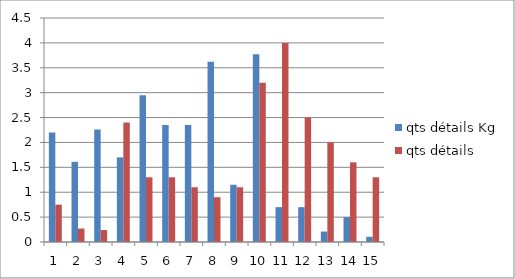
| Category | qts détails Kg | qts détails |
|---|---|---|
| 0 | 2.2 | 0.75 |
| 1 | 1.61 | 0.27 |
| 2 | 2.26 | 0.24 |
| 3 | 1.7 | 2.4 |
| 4 | 2.95 | 1.3 |
| 5 | 2.35 | 1.3 |
| 6 | 2.35 | 1.1 |
| 7 | 3.62 | 0.9 |
| 8 | 1.15 | 1.1 |
| 9 | 3.77 | 3.2 |
| 10 | 0.7 | 4 |
| 11 | 0.7 | 2.5 |
| 12 | 0.21 | 2 |
| 13 | 0.5 | 1.6 |
| 14 | 0.105 | 1.3 |